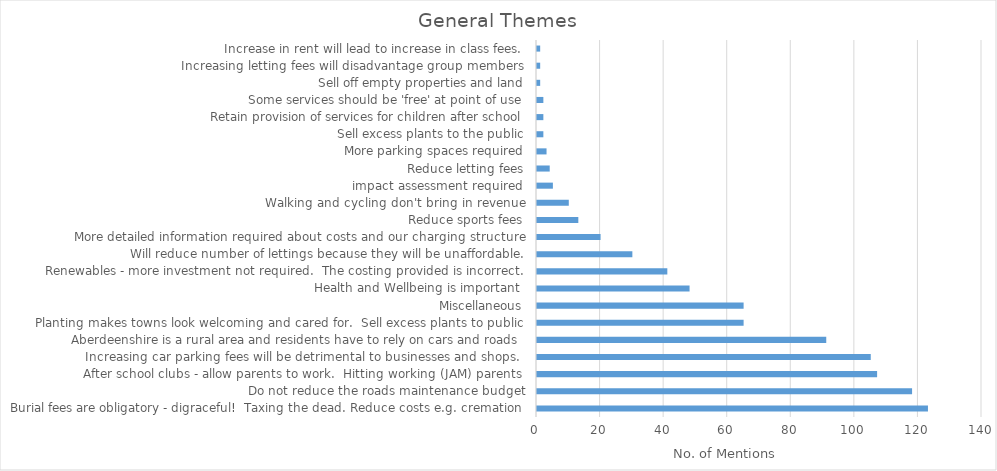
| Category | Series 0 |
|---|---|
| Burial fees are obligatory - digraceful!  Taxing the dead. Reduce costs e.g. cremation | 123 |
| Do not reduce the roads maintenance budget | 118 |
| After school clubs - allow parents to work.  Hitting working (JAM) parents  | 107 |
| Increasing car parking fees will be detrimental to businesses and shops.  | 105 |
| Aberdeenshire is a rural area and residents have to rely on cars and roads  | 91 |
| Planting makes towns look welcoming and cared for.  Sell excess plants to public | 65 |
| Miscellaneous | 65 |
| Health and Wellbeing is important  | 48 |
| Renewables - more investment not required.  The costing provided is incorrect. | 41 |
| Will reduce number of lettings because they will be unaffordable. | 30 |
| More detailed information required about costs and our charging structure | 20 |
| Reduce sports fees | 13 |
| Walking and cycling don't bring in revenue | 10 |
| impact assessment required | 5 |
| Reduce letting fees | 4 |
| More parking spaces required | 3 |
| Sell excess plants to the public | 2 |
| Retain provision of services for children after school | 2 |
| Some services should be 'free' at point of use | 2 |
| Sell off empty properties and land | 1 |
| Increasing letting fees will disadvantage group members | 1 |
| Increase in rent will lead to increase in class fees. | 1 |